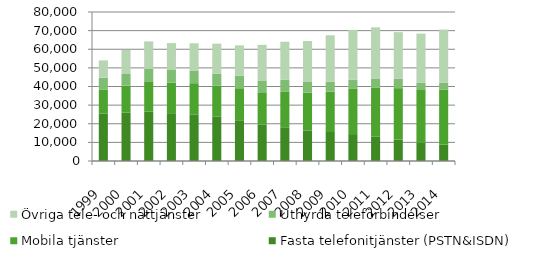
| Category | Fasta telefonitjänster (PSTN&ISDN) | Mobila tjänster | Uthyrda teleförbindelser | Övriga tele- och nättjänster |
|---|---|---|---|---|
| 1999.0 | 25529 | 12658 | 6536 | 9279 |
| 2000.0 | 26044 | 14407 | 6261 | 12939 |
| 2001.0 | 26537 | 16248 | 6746 | 14673 |
| 2002.0 | 25272 | 16760 | 7147 | 14106 |
| 2003.0 | 25047 | 16709 | 6875 | 14569 |
| 2004.0 | 23957 | 16427 | 6531 | 16073 |
| 2005.0 | 21883 | 17185 | 6692 | 16339 |
| 2006.0 | 19605 | 17288 | 6343 | 19130 |
| 2007.0 | 18116 | 19252 | 6260 | 20396 |
| 2008.0 | 16322 | 20381 | 5742 | 21965 |
| 2009.0 | 15573 | 21661 | 5381 | 24895 |
| 2010.0 | 14442 | 24261 | 4895 | 26798 |
| 2011.0 | 13017 | 26503 | 4516 | 27733 |
| 2012.0 | 11517 | 27590 | 5161.6 | 24911.2 |
| 2013.0 | 9807.503 | 28699.911 | 3619.6 | 26266.886 |
| 2014.0 | 8803 | 29601 | 3579 | 28576 |